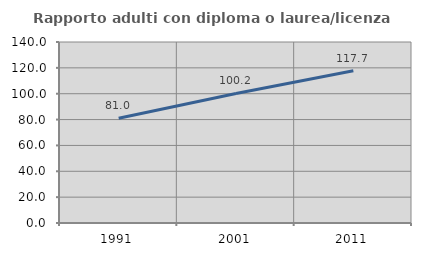
| Category | Rapporto adulti con diploma o laurea/licenza media  |
|---|---|
| 1991.0 | 80.972 |
| 2001.0 | 100.177 |
| 2011.0 | 117.726 |